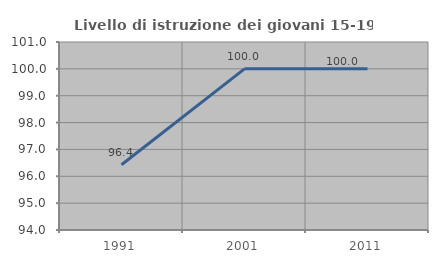
| Category | Livello di istruzione dei giovani 15-19 anni |
|---|---|
| 1991.0 | 96.429 |
| 2001.0 | 100 |
| 2011.0 | 100 |